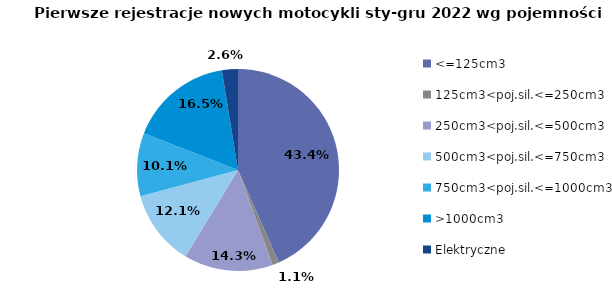
| Category | Series 0 |
|---|---|
| <=125cm3 | 10373 |
| 125cm3<poj.sil.<=250cm3 | 252 |
| 250cm3<poj.sil.<=500cm3 | 3411 |
| 500cm3<poj.sil.<=750cm3 | 2899 |
| 750cm3<poj.sil.<=1000cm3 | 2416 |
| >1000cm3 | 3947 |
| Elektryczne | 612 |